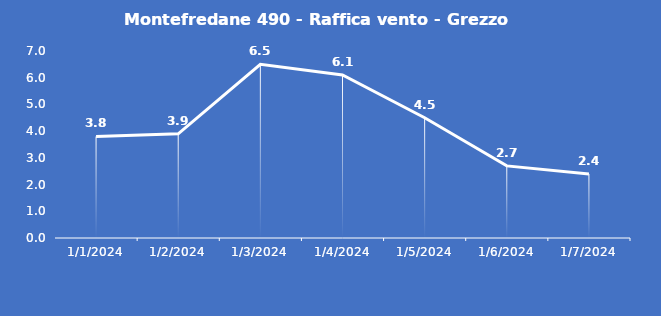
| Category | Montefredane 490 - Raffica vento - Grezzo (m/s) |
|---|---|
| 1/1/24 | 3.8 |
| 1/2/24 | 3.9 |
| 1/3/24 | 6.5 |
| 1/4/24 | 6.1 |
| 1/5/24 | 4.5 |
| 1/6/24 | 2.7 |
| 1/7/24 | 2.4 |